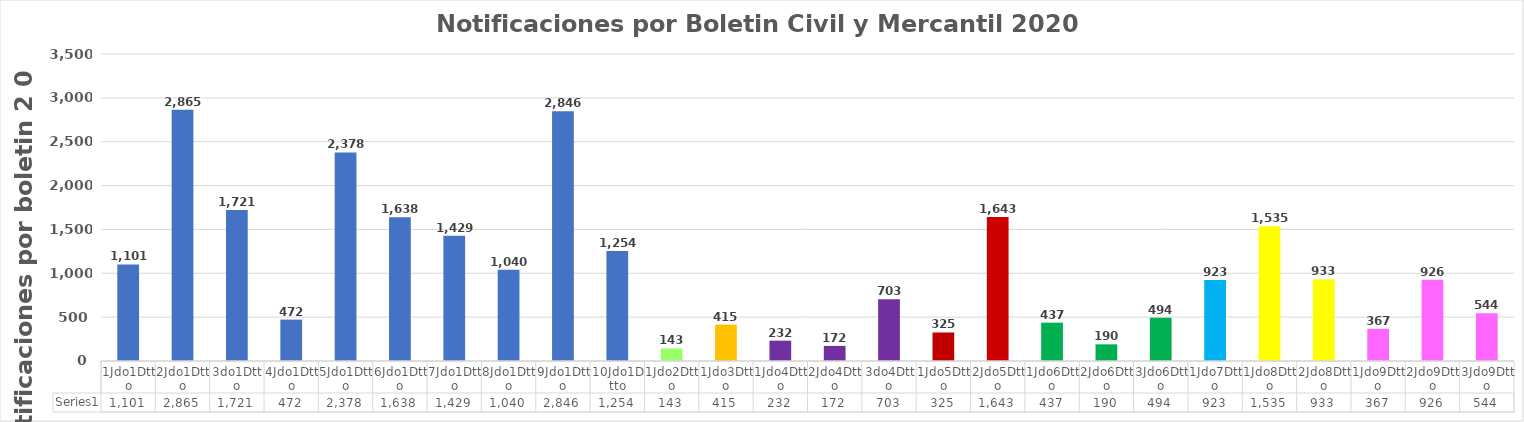
| Category | Series 0 |
|---|---|
| 1Jdo1Dtto | 1101 |
| 2Jdo1Dtto | 2865 |
| 3do1Dtto | 1721 |
| 4Jdo1Dtto | 472 |
| 5Jdo1Dtto | 2378 |
| 6Jdo1Dtto | 1638 |
| 7Jdo1Dtto | 1429 |
| 8Jdo1Dtto | 1040 |
| 9Jdo1Dtto | 2846 |
| 10Jdo1Dtto | 1254 |
| 1Jdo2Dtto | 143 |
| 1Jdo3Dtto | 415 |
| 1Jdo4Dtto | 232 |
| 2Jdo4Dtto | 172 |
| 3do4Dtto | 703 |
| 1Jdo5Dtto | 325 |
| 2Jdo5Dtto | 1643 |
| 1Jdo6Dtto | 437 |
| 2Jdo6Dtto | 190 |
| 3Jdo6Dtto | 494 |
| 1Jdo7Dtto | 923 |
| 1Jdo8Dtto | 1535 |
| 2Jdo8Dtto | 933 |
| 1Jdo9Dtto | 367 |
| 2Jdo9Dtto | 926 |
| 3Jdo9Dtto | 544 |